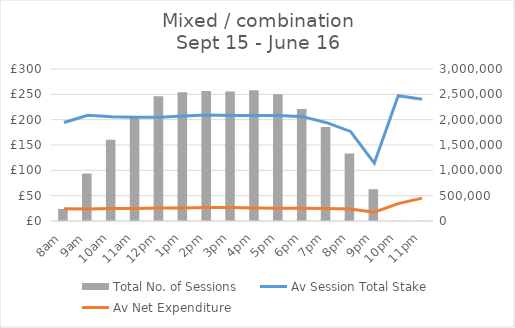
| Category | Total No. of Sessions |
|---|---|
| 8am | 237792 |
| 9am | 936550 |
| 10am | 1604001 |
| 11am | 2054919 |
| 12pm | 2461578 |
| 1pm | 2540329 |
| 2pm | 2564618 |
| 3pm | 2556730 |
| 4pm | 2580794 |
| 5pm | 2499225 |
| 6pm | 2209647 |
| 7pm | 1853113 |
| 8pm | 1331775 |
| 9pm | 627951 |
| 10pm | 2381 |
| 11pm | 1195 |